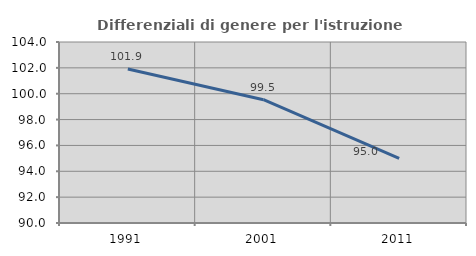
| Category | Differenziali di genere per l'istruzione superiore |
|---|---|
| 1991.0 | 101.916 |
| 2001.0 | 99.533 |
| 2011.0 | 95.007 |